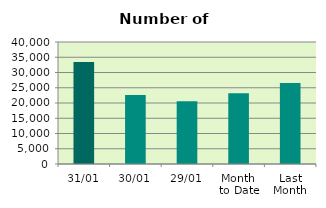
| Category | Series 0 |
|---|---|
| 31/01 | 33464 |
| 30/01 | 22590 |
| 29/01 | 20576 |
| Month 
to Date | 23216.727 |
| Last
Month | 26558.947 |